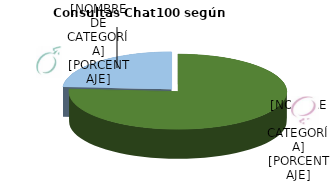
| Category | Series 0 |
|---|---|
| Mujer | 13236 |
| Hombre | 4170 |